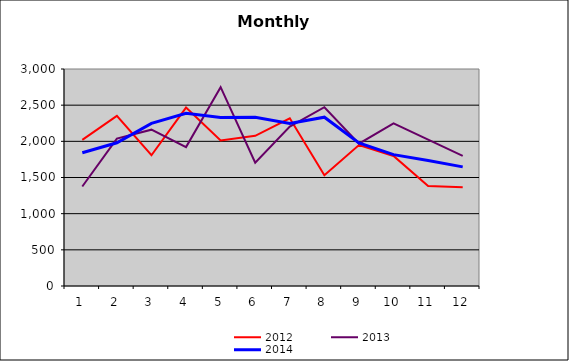
| Category | 2012 | 2013 | 2014 |
|---|---|---|---|
| 0 | 2020.89 | 1375.298 | 1842.078 |
| 1 | 2351.855 | 2038.391 | 1980.383 |
| 2 | 1807.378 | 2161.381 | 2247.948 |
| 3 | 2466.683 | 1919.971 | 2386.701 |
| 4 | 2012.063 | 2748.309 | 2328.974 |
| 5 | 2075.743 | 1705.243 | 2333.035 |
| 6 | 2318.054 | 2203.49 | 2246.713 |
| 7 | 1532.482 | 2471.28 | 2333.672 |
| 8 | 1949.159 | 1968.263 | 1977.073 |
| 9 | 1798.136 | 2248.057 | 1816.383 |
| 10 | 1382.248 | 2024.778 | 1734.81 |
| 11 | 1366.86 | 1799.99 | 1647.071 |